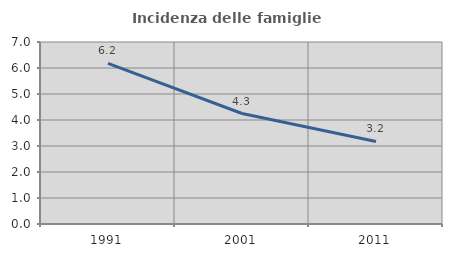
| Category | Incidenza delle famiglie numerose |
|---|---|
| 1991.0 | 6.177 |
| 2001.0 | 4.25 |
| 2011.0 | 3.174 |